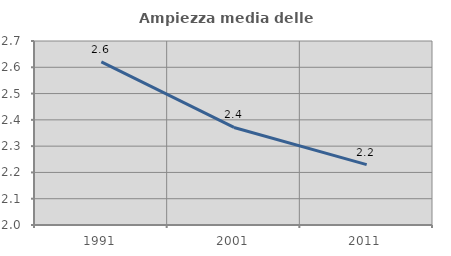
| Category | Ampiezza media delle famiglie |
|---|---|
| 1991.0 | 2.621 |
| 2001.0 | 2.371 |
| 2011.0 | 2.23 |